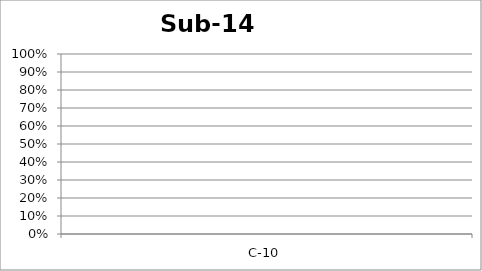
| Category | Sub-14 |
|---|---|
| C-10 | 0 |